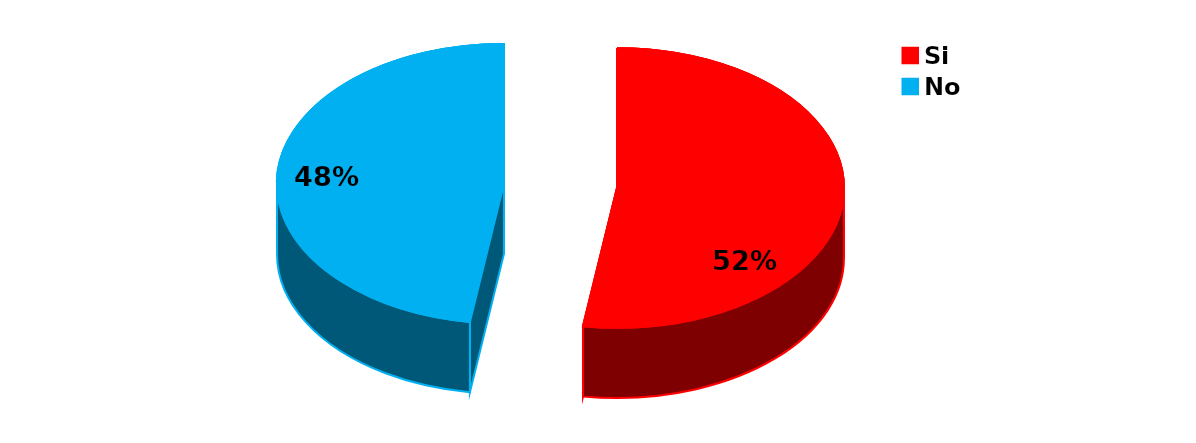
| Category | Series 0 |
|---|---|
| Si | 175 |
| No | 159 |